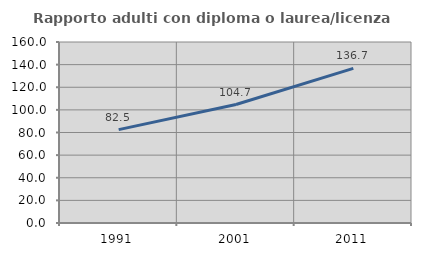
| Category | Rapporto adulti con diploma o laurea/licenza media  |
|---|---|
| 1991.0 | 82.549 |
| 2001.0 | 104.748 |
| 2011.0 | 136.653 |